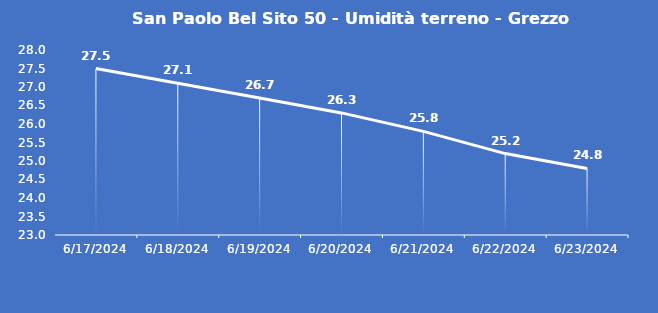
| Category | San Paolo Bel Sito 50 - Umidità terreno - Grezzo (%VWC) |
|---|---|
| 6/17/24 | 27.5 |
| 6/18/24 | 27.1 |
| 6/19/24 | 26.7 |
| 6/20/24 | 26.3 |
| 6/21/24 | 25.8 |
| 6/22/24 | 25.2 |
| 6/23/24 | 24.8 |